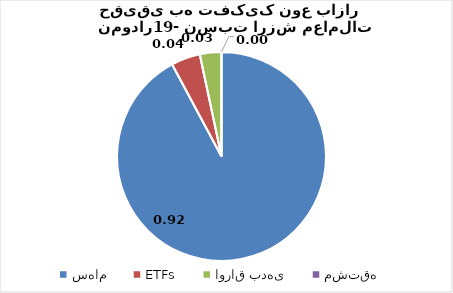
| Category | Series 0 |
|---|---|
| سهام | 0.922 |
| ETFs | 0.045 |
| اوراق بدهی | 0.033 |
| مشتقه | 0 |